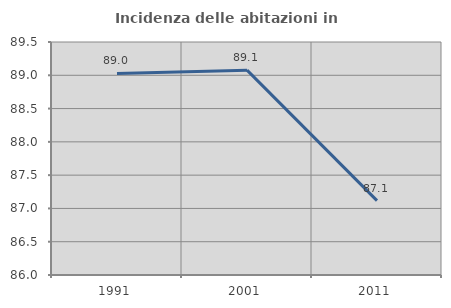
| Category | Incidenza delle abitazioni in proprietà  |
|---|---|
| 1991.0 | 89.028 |
| 2001.0 | 89.077 |
| 2011.0 | 87.118 |